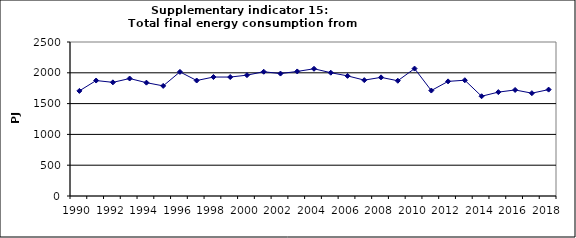
| Category | Total final energy consumption from households, PJ |
|---|---|
| 1990 | 1706.351 |
| 1991 | 1874.334 |
| 1992 | 1844.968 |
| 1993 | 1907.029 |
| 1994 | 1839.956 |
| 1995 | 1787.374 |
| 1996 | 2014.683 |
| 1997 | 1874.656 |
| 1998 | 1931.199 |
| 1999 | 1930.987 |
| 2000 | 1961.565 |
| 2001 | 2017.13 |
| 2002 | 1987.5 |
| 2003 | 2021.932 |
| 2004 | 2065.466 |
| 2005 | 2001.517 |
| 2006 | 1950.008 |
| 2007 | 1881.231 |
| 2008 | 1925.841 |
| 2009 | 1870.861 |
| 2010 | 2068.713 |
| 2011 | 1711.676 |
| 2012 | 1860.656 |
| 2013 | 1879.479 |
| 2014 | 1619.456 |
| 2015 | 1686.505 |
| 2016 | 1721.329 |
| 2017 | 1669.455 |
| 2018 | 1727.026 |